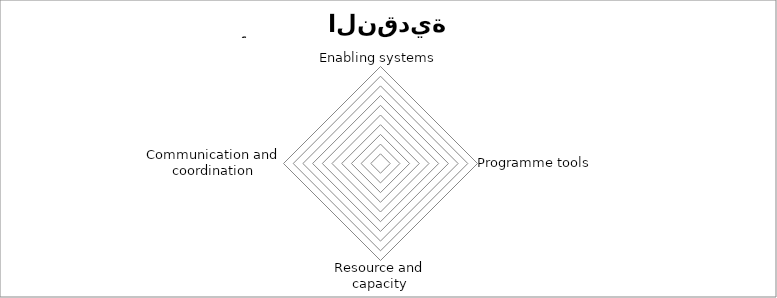
| Category | Series 0 |
|---|---|
| Enabling systems | 0 |
| Programme tools | 0 |
| Resource and capacity | 0 |
| Communication and coordination | 0 |